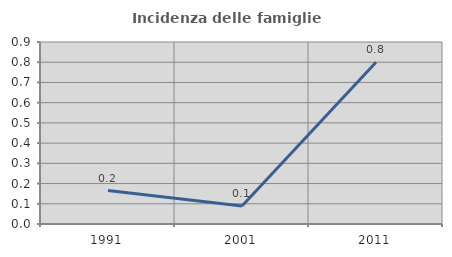
| Category | Incidenza delle famiglie numerose |
|---|---|
| 1991.0 | 0.165 |
| 2001.0 | 0.089 |
| 2011.0 | 0.8 |